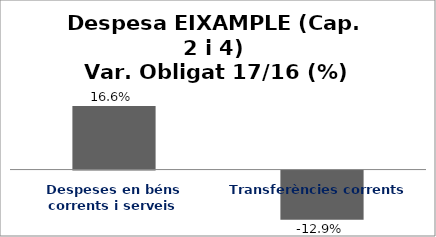
| Category | Series 0 |
|---|---|
| Despeses en béns corrents i serveis | 0.166 |
| Transferències corrents | -0.129 |